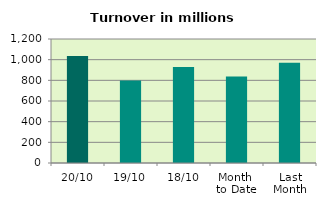
| Category | Series 0 |
|---|---|
| 20/10 | 1035.389 |
| 19/10 | 799.241 |
| 18/10 | 928.216 |
| Month 
to Date | 836.925 |
| Last
Month | 970.98 |